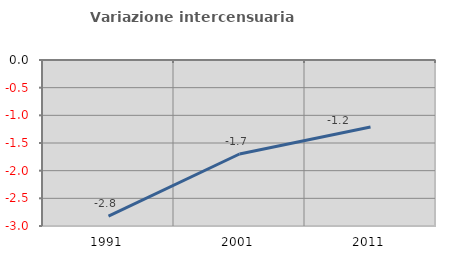
| Category | Variazione intercensuaria annua |
|---|---|
| 1991.0 | -2.822 |
| 2001.0 | -1.699 |
| 2011.0 | -1.211 |